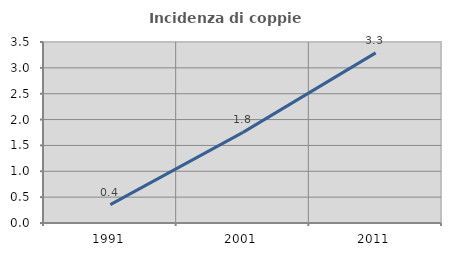
| Category | Incidenza di coppie miste |
|---|---|
| 1991.0 | 0.355 |
| 2001.0 | 1.752 |
| 2011.0 | 3.289 |